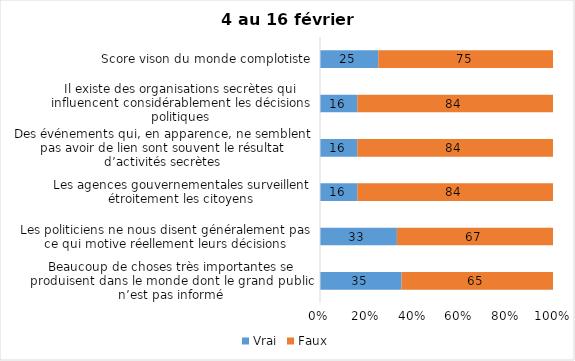
| Category | Vrai | Faux |
|---|---|---|
| Beaucoup de choses très importantes se produisent dans le monde dont le grand public n’est pas informé | 35 | 65 |
| Les politiciens ne nous disent généralement pas ce qui motive réellement leurs décisions | 33 | 67 |
| Les agences gouvernementales surveillent étroitement les citoyens | 16 | 84 |
| Des événements qui, en apparence, ne semblent pas avoir de lien sont souvent le résultat d’activités secrètes | 16 | 84 |
| Il existe des organisations secrètes qui influencent considérablement les décisions politiques | 16 | 84 |
| Score vison du monde complotiste | 25 | 75 |